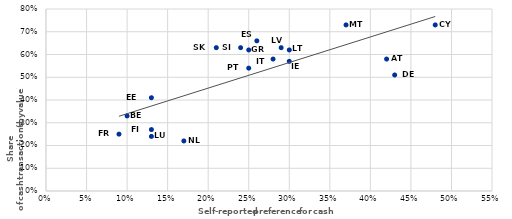
| Category | Series 0 |
|---|---|
| 0.17 | 0.22 |
| 0.13 | 0.27 |
| 0.13 | 0.24 |
| 0.09 | 0.25 |
| 0.1 | 0.33 |
| 0.13 | 0.41 |
| 0.43 | 0.51 |
| 0.25 | 0.54 |
| 0.42 | 0.58 |
| 0.3 | 0.57 |
| 0.3 | 0.62 |
| 0.28 | 0.58 |
| 0.29 | 0.63 |
| 0.25 | 0.62 |
| 0.24 | 0.63 |
| 0.21 | 0.63 |
| 0.26 | 0.66 |
| 0.48 | 0.73 |
| 0.37 | 0.73 |